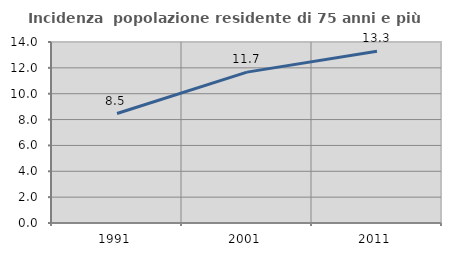
| Category | Incidenza  popolazione residente di 75 anni e più |
|---|---|
| 1991.0 | 8.469 |
| 2001.0 | 11.67 |
| 2011.0 | 13.277 |